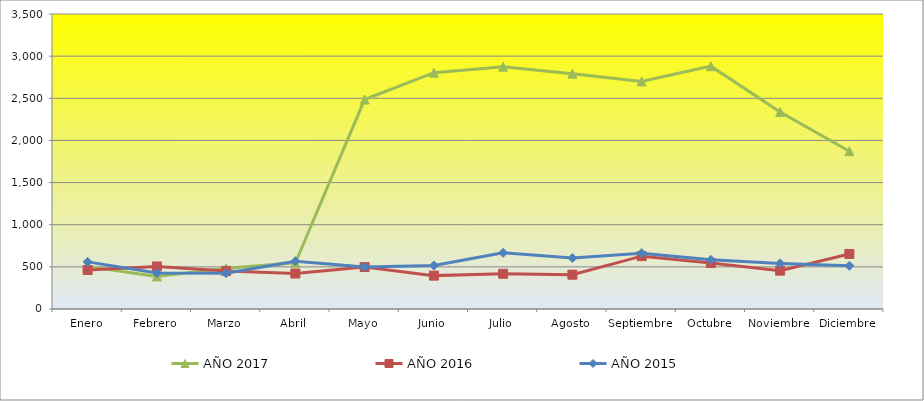
| Category | AÑO 2017 | AÑO 2016 | AÑO 2015 |
|---|---|---|---|
| Enero | 504.561 | 463 | 559 |
| Febrero | 385.965 | 505 | 426 |
| Marzo | 482.807 | 452 | 425 |
| Abril | 548.07 | 421 | 567 |
| Mayo | 2485.173 | 498 | 498 |
| Junio | 2803.669 | 396 | 516 |
| Julio | 2874.848 | 418 | 666 |
| Agosto | 2792.035 | 407 | 604 |
| Septiembre | 2700 | 627 | 662 |
| Octubre | 2881.172 | 545 | 583 |
| Noviembre | 2337.981 | 455 | 541 |
| Diciembre | 1872.165 | 653 | 513 |